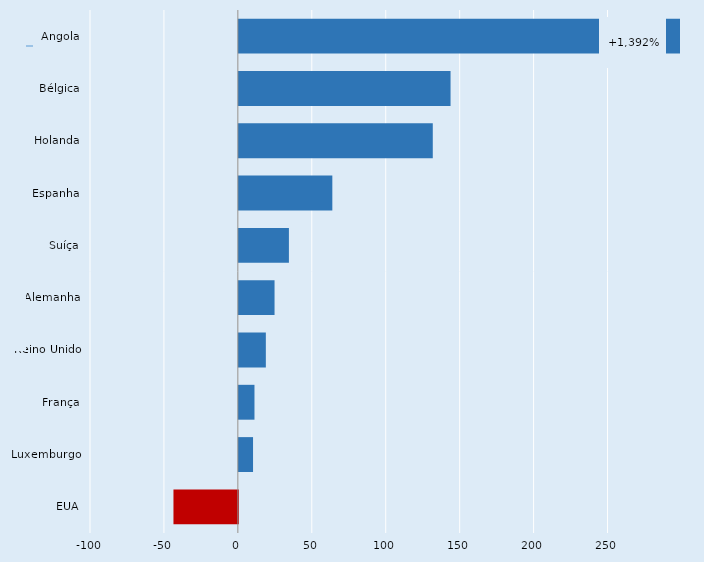
| Category | Series 0 |
|---|---|
| Angola | 1392.437 |
| Bélgica | 143.154 |
| Holanda | 131.135 |
| Espanha | 63.207 |
| Suíça | 33.843 |
| Alemanha | 24.129 |
| Reino Unido | 18.24 |
| França | 10.556 |
| Luxemburgo | 9.583 |
| EUA | -43.558 |